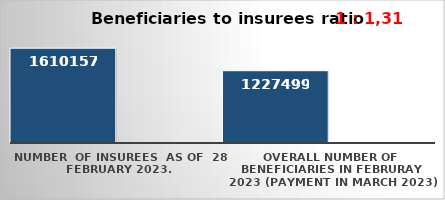
| Category | Series 0 | Series 1 |
|---|---|---|
| NUMBER  of insurees  as of  28 February 2023. | 1610157 |  |
| OVERALL number of beneficiaries in Februray 2023 (payment in March 2023) | 1227499 |  |